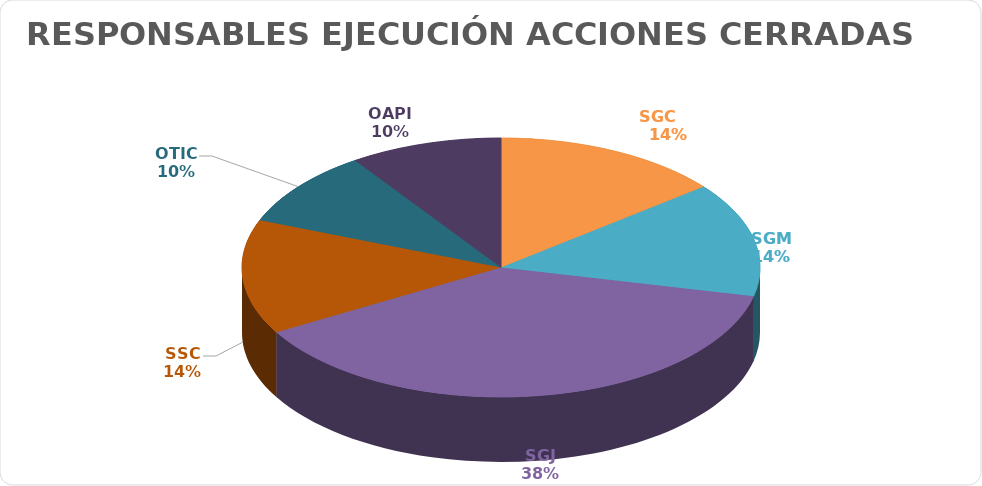
| Category | Series 0 |
|---|---|
| SGC     | 3 |
| SGM | 3 |
| SGJ | 8 |
| SSC | 3 |
| OTIC | 2 |
| OAPI | 2 |